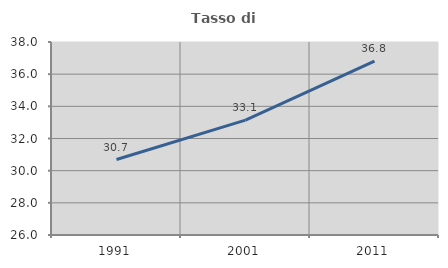
| Category | Tasso di occupazione   |
|---|---|
| 1991.0 | 30.692 |
| 2001.0 | 33.139 |
| 2011.0 | 36.817 |